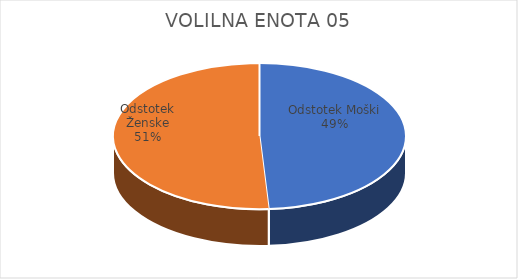
| Category | VOLILNA ENOTA 05 | #REF! | Slovenija skupaj |
|---|---|---|---|
| Odstotek Moški | 13.18 |  | 13.7 |
| Odstotek Ženske | 13.72 |  | 14.52 |